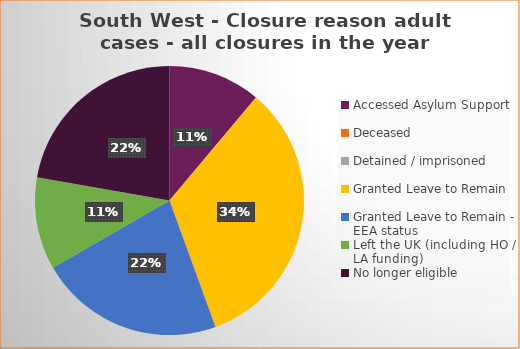
| Category | Total | Percentage |
|---|---|---|
| Accessed Asylum Support | 1 | 0.111 |
| Deceased | 0 | 0 |
| Detained / imprisoned | 0 | 0 |
| Granted Leave to Remain | 3 | 0.34 |
| Granted Leave to Remain - EEA status | 2 | 0.222 |
| Left the UK (including HO / LA funding)  | 1 | 0.111 |
| No longer eligible | 2 | 0.222 |